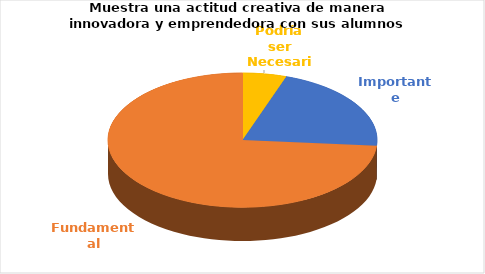
| Category | Series 0 |
|---|---|
| Podría ser Necesaria | 1 |
| Importante | 4 |
| Fundamental | 14 |